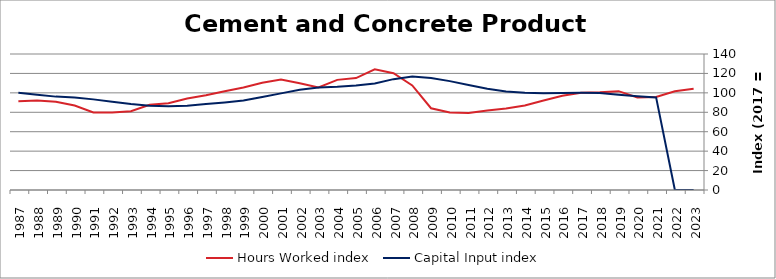
| Category | Hours Worked index | Capital Input index |
|---|---|---|
| 2023.0 | 104.166 | 0 |
| 2022.0 | 101.657 | 0 |
| 2021.0 | 95.731 | 95.326 |
| 2020.0 | 95.236 | 96.522 |
| 2019.0 | 101.763 | 98.051 |
| 2018.0 | 100.62 | 99.93 |
| 2017.0 | 100 | 100 |
| 2016.0 | 97.092 | 99.934 |
| 2015.0 | 92.038 | 99.71 |
| 2014.0 | 86.958 | 99.991 |
| 2013.0 | 84.01 | 101.442 |
| 2012.0 | 81.733 | 104.238 |
| 2011.0 | 79.161 | 108.148 |
| 2010.0 | 79.75 | 112.067 |
| 2009.0 | 84.176 | 115.395 |
| 2008.0 | 107.654 | 116.92 |
| 2007.0 | 120.154 | 114.11 |
| 2006.0 | 124.319 | 109.656 |
| 2005.0 | 115.221 | 107.552 |
| 2004.0 | 113.379 | 106.161 |
| 2003.0 | 105.47 | 105.539 |
| 2002.0 | 109.922 | 103.161 |
| 2001.0 | 113.744 | 99.475 |
| 2000.0 | 110.34 | 95.646 |
| 1999.0 | 105.441 | 92.171 |
| 1998.0 | 101.551 | 90.165 |
| 1997.0 | 97.59 | 88.452 |
| 1996.0 | 94.196 | 86.839 |
| 1995.0 | 89.341 | 86.323 |
| 1994.0 | 87.708 | 86.847 |
| 1993.0 | 81.125 | 88.574 |
| 1992.0 | 79.661 | 90.856 |
| 1991.0 | 79.775 | 93.289 |
| 1990.0 | 86.9 | 95.263 |
| 1989.0 | 90.928 | 96.125 |
| 1988.0 | 92.163 | 98.122 |
| 1987.0 | 91.315 | 100.139 |